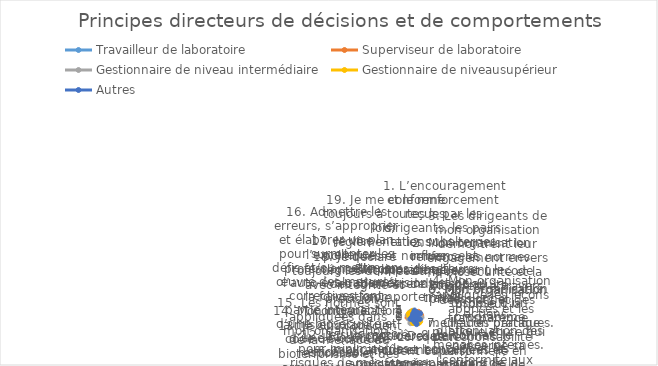
| Category | Travailleur de laboratoire | Superviseur de laboratoire | Gestionnaire de niveau intermédiaire | Gestionnaire de niveausupérieur | Autres |
|---|---|---|---|---|---|
| Principes directeurs de décisions et de comportements | 3 | 4 | 1 | 2 | 5 |
| 1. L’encouragement et le renforcement reçus par les dirigeants, les pairs et les subalternes influencent considérablement le rendement au travail. | 3 | 4 | 0 | 0 | 4 |
| 2. Mon organisation renforce les normes éthiques et un code de conduite professionnel. | 1 | 5 | 2 | 0 | 4 |
| 3. Les dirigeants de mon organisation démontrent leur engagement envers la biosécurité et la biosûreté à travers des mots et des actions. | 5 | 5 | 3 | 1 | 5 |
| 4. Mon organisation applique les leçons apprises et les meilleures pratiques. | 4 | 5 | 1 | 1 | 1 |
| 5. Mon organisation dispose d’un programme d’atténuation des menaces internes. | 4 | 2 | 5 | 0 | 2 |
| 6. Mon organisation promeut la transparence publique en ce qui concerne sa conformité aux exigences de biosécurité et de biosûreté. | 4 | 4 | 4 | 3 | 4 |
| 7. Chacun partage sa responsabilité personnelle en matière de de biosécurité et de biosûreté. | 0 | 1 | 4 | 5 | 2 |
| 8. Je connais le concept et les implications de la recherche préoccupante à double usage. | 2 | 2 | 2 | 5 | 2 |
| 9. Des personnes dûment qualifiées et formées assurent la surveillance de la biosécurité et de la biosûreté. | 0 | 0 | 0 | 4 | 5 |
| 10. Lorsqu’un incident ou un quasi-accident se produit, les gens procèdent à un remue-méninge au lieu de se blâmer. La question posée est « qu’est-ce qui a mal tourné ? » pas « qui avait tort ? », en se concentrant sur l’amélioration, pas sur le blâme. | 2 | 2 | 2 | 4 | 3 |
| 11. Je considère les implications et les applications possibles de mon travail et l’équilibre entre la recherche de connaissances scientifiques et mes responsabilités éthiques envers la société. | 4 | 2 | 3 | 4 | 0 |
| 12. Je suis motivé pour minimiser les risques de mésusage de la science pour la société. | 2 | 1 | 5 | 2 | 1 |
| 13. Je suis conscient de la menace du bioterrorisme et des armes biologiques. | 1 | 2 | 1 | 0 | 2 |
| 14. Mon organisation a mis en place un code de conduite responsable. | 1 | 1 | 4 | 1 | 3 |
| 15. Les normes sont appliquées dans mon organisation. | 4 | 5 | 1 | 1 | 2 |
| 16. Admettre les erreurs, s’approprier et élaborer un plan pour surmonter les défis et/ou mettre en œuvre des mesures correctives font partie intégrante d’une biosécurité et d’une biosûreté efficaces. | 0 | 5 | 5 | 4 | 1 |
| 17. Je vise l’excellence professionnelle par l’auto-évaluation et la formation continue. | 1 | 3 | 3 | 5 | 0 |
| 18. Je déclare toujours les données avec intégrité et précision. | 3 | 2 | 5 | 4 | 2 |
| 19. Je me conforme toujours à toutes les lois, réglementations, politiques et normes régissant la pratique des sciences de la vie. | 3 | 0 | 0 | 5 | 3 |